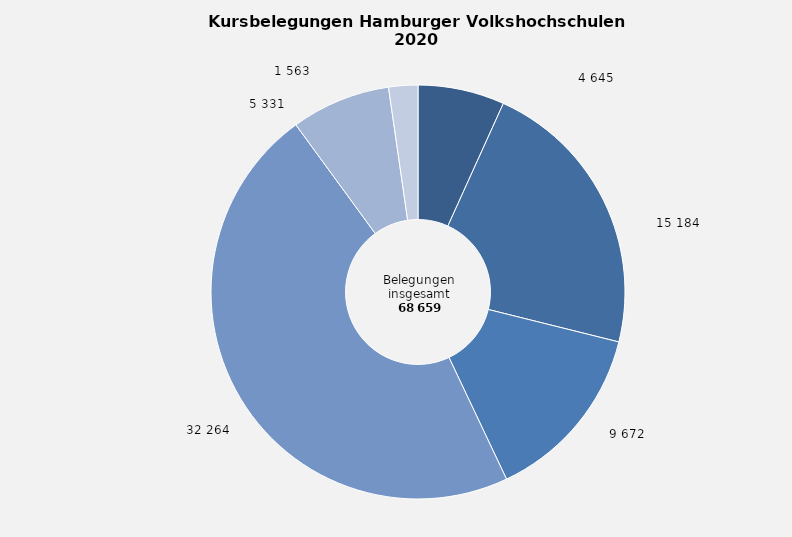
| Category | Anteil in Prozent |
|---|---|
| Politik, Gesellschaft, Umwelt | 6.765 |
| Kultur, Gestalten | 22.115 |
| Gesundheit | 14.087 |
| Sprachen | 46.992 |
| Arbeit, Beruf | 7.764 |
| Grundbildung, Schulabschlüsse | 2.276 |